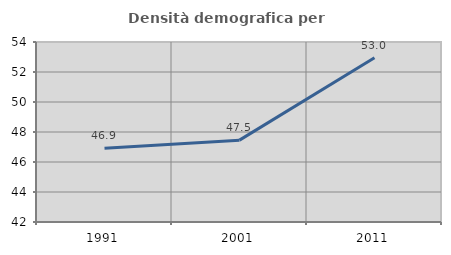
| Category | Densità demografica |
|---|---|
| 1991.0 | 46.924 |
| 2001.0 | 47.456 |
| 2011.0 | 52.956 |